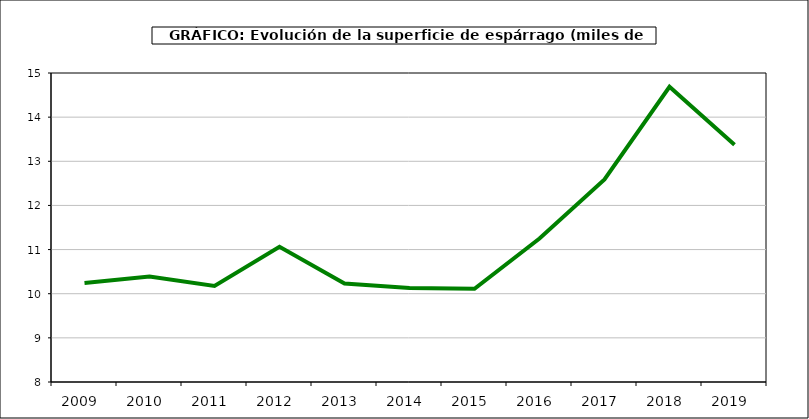
| Category | superficie |
|---|---|
| 2009.0 | 10.243 |
| 2010.0 | 10.387 |
| 2011.0 | 10.178 |
| 2012.0 | 11.065 |
| 2013.0 | 10.231 |
| 2014.0 | 10.132 |
| 2015.0 | 10.112 |
| 2016.0 | 11.251 |
| 2017.0 | 12.589 |
| 2018.0 | 14.688 |
| 2019.0 | 13.373 |